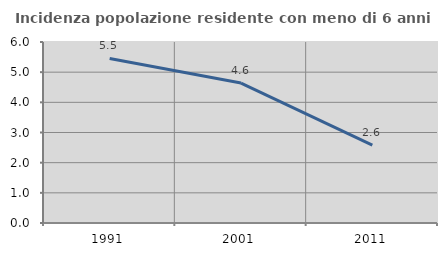
| Category | Incidenza popolazione residente con meno di 6 anni |
|---|---|
| 1991.0 | 5.456 |
| 2001.0 | 4.639 |
| 2011.0 | 2.582 |